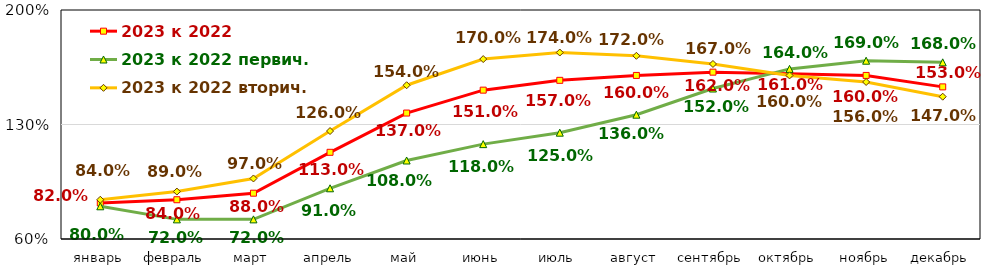
| Category | 2023 к 2022 | 2023 к 2022 первич. | 2023 к 2022 вторич. |
|---|---|---|---|
| январь | 0.82 | 0.8 | 0.84 |
| февраль | 0.84 | 0.72 | 0.89 |
| март | 0.88 | 0.72 | 0.97 |
| апрель | 1.13 | 0.91 | 1.26 |
| май | 1.37 | 1.08 | 1.54 |
| июнь | 1.51 | 1.18 | 1.7 |
| июль | 1.57 | 1.25 | 1.74 |
| август | 1.6 | 1.36 | 1.72 |
| сентябрь | 1.62 | 1.52 | 1.67 |
| октябрь | 1.61 | 1.64 | 1.6 |
| ноябрь | 1.6 | 1.69 | 1.56 |
| декабрь | 1.53 | 1.68 | 1.47 |